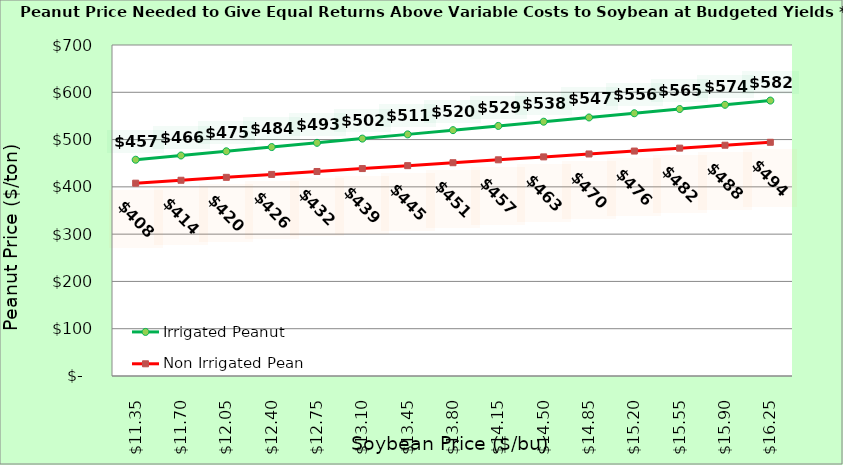
| Category | Irrigated Peanut | Non Irrigated Peanut |
|---|---|---|
| 11.350000000000003 | 457.366 | 407.786 |
| 11.700000000000003 | 466.302 | 413.963 |
| 12.050000000000002 | 475.238 | 420.139 |
| 12.400000000000002 | 484.175 | 426.316 |
| 12.750000000000002 | 493.111 | 432.492 |
| 13.100000000000001 | 502.047 | 438.669 |
| 13.450000000000001 | 510.983 | 444.845 |
| 13.8 | 519.919 | 451.021 |
| 14.15 | 528.855 | 457.198 |
| 14.5 | 537.792 | 463.374 |
| 14.85 | 546.728 | 469.551 |
| 15.2 | 555.664 | 475.727 |
| 15.549999999999999 | 564.6 | 481.904 |
| 15.899999999999999 | 573.536 | 488.08 |
| 16.25 | 582.472 | 494.257 |